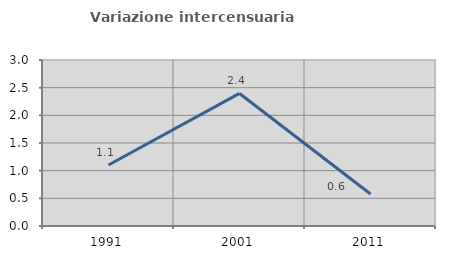
| Category | Variazione intercensuaria annua |
|---|---|
| 1991.0 | 1.103 |
| 2001.0 | 2.396 |
| 2011.0 | 0.579 |